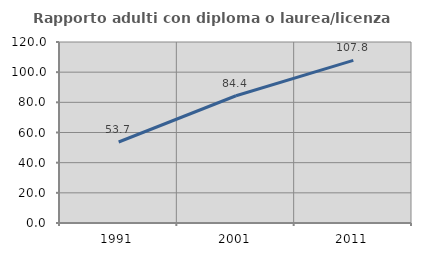
| Category | Rapporto adulti con diploma o laurea/licenza media  |
|---|---|
| 1991.0 | 53.704 |
| 2001.0 | 84.375 |
| 2011.0 | 107.792 |